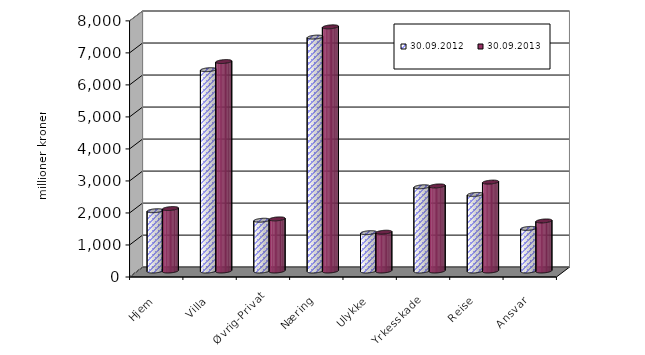
| Category | 30.09.2012 | 30.09.2013 |
|---|---|---|
| Hjem | 1883.176 | 1950.638 |
| Villa | 6288.202 | 6541.909 |
| Øvrig-Privat | 1585.834 | 1627.973 |
| Næring | 7305.669 | 7626.616 |
| Ulykke | 1197.502 | 1211.738 |
| Yrkesskade | 2630.833 | 2657.396 |
| Reise | 2391.982 | 2777.051 |
| Ansvar | 1330.946 | 1563.493 |